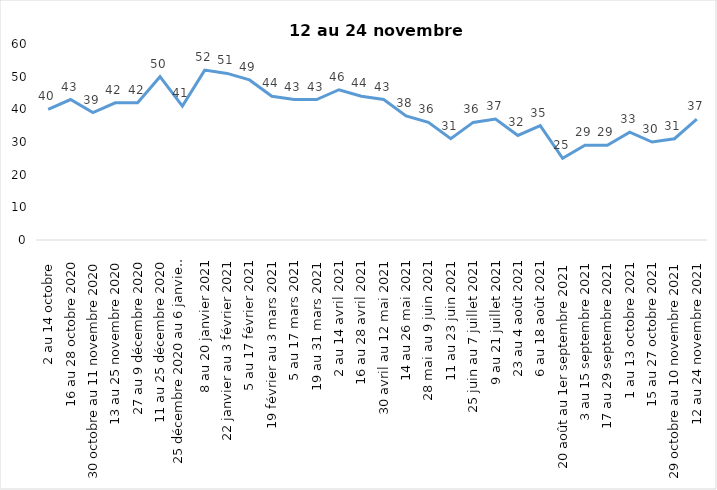
| Category | Toujours aux trois mesures |
|---|---|
| 2 au 14 octobre  | 40 |
| 16 au 28 octobre 2020 | 43 |
| 30 octobre au 11 novembre 2020 | 39 |
| 13 au 25 novembre 2020 | 42 |
| 27 au 9 décembre 2020 | 42 |
| 11 au 25 décembre 2020 | 50 |
| 25 décembre 2020 au 6 janvier 2021 | 41 |
| 8 au 20 janvier 2021 | 52 |
| 22 janvier au 3 février 2021 | 51 |
| 5 au 17 février 2021 | 49 |
| 19 février au 3 mars 2021 | 44 |
| 5 au 17 mars 2021 | 43 |
| 19 au 31 mars 2021 | 43 |
| 2 au 14 avril 2021 | 46 |
| 16 au 28 avril 2021 | 44 |
| 30 avril au 12 mai 2021 | 43 |
| 14 au 26 mai 2021 | 38 |
| 28 mai au 9 juin 2021 | 36 |
| 11 au 23 juin 2021 | 31 |
| 25 juin au 7 juillet 2021 | 36 |
| 9 au 21 juillet 2021 | 37 |
| 23 au 4 août 2021 | 32 |
| 6 au 18 août 2021 | 35 |
| 20 août au 1er septembre 2021 | 25 |
| 3 au 15 septembre 2021 | 29 |
| 17 au 29 septembre 2021 | 29 |
| 1 au 13 octobre 2021 | 33 |
| 15 au 27 octobre 2021 | 30 |
| 29 octobre au 10 novembre 2021 | 31 |
| 12 au 24 novembre 2021 | 37 |